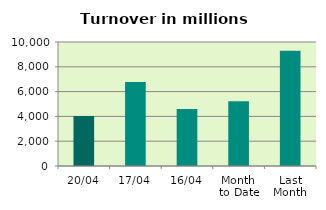
| Category | Series 0 |
|---|---|
| 20/04 | 4027.098 |
| 17/04 | 6768.023 |
| 16/04 | 4599.649 |
| Month 
to Date | 5214.711 |
| Last
Month | 9287.764 |